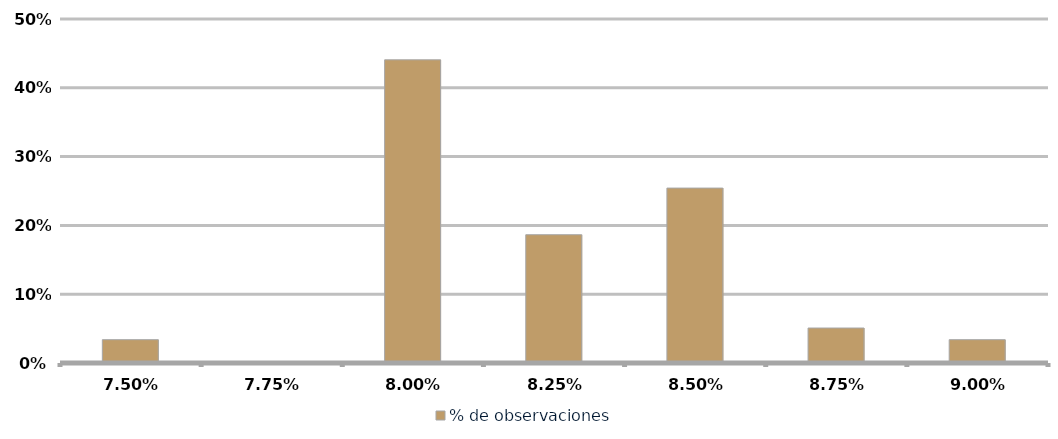
| Category | % de observaciones  |
|---|---|
| 0.075 | 0.034 |
| 0.0775 | 0 |
| 0.08 | 0.441 |
| 0.0825 | 0.186 |
| 0.085 | 0.254 |
| 0.08750000000000001 | 0.051 |
| 0.09000000000000001 | 0.034 |